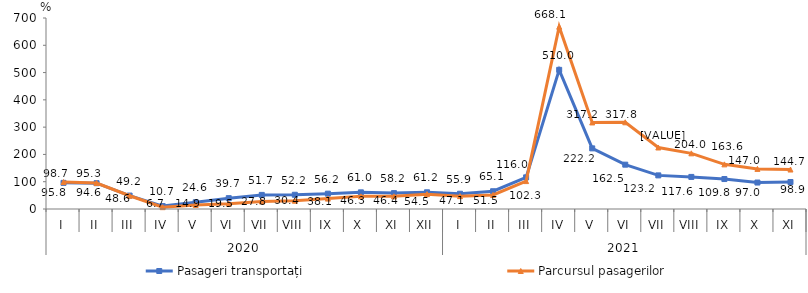
| Category | Pasageri transportați | Parcursul pasagerilor |
|---|---|---|
| 0 | 95.8 | 98.7 |
| 1 | 94.6 | 95.3 |
| 2 | 49.2 | 48.6 |
| 3 | 10.7 | 6.7 |
| 4 | 24.6 | 14.9 |
| 5 | 39.7 | 19.5 |
| 6 | 51.7 | 27.8 |
| 7 | 52.2 | 30.4 |
| 8 | 56.2 | 38.1 |
| 9 | 61 | 46.3 |
| 10 | 58.2 | 46.4 |
| 11 | 61.2 | 54.5 |
| 12 | 55.9 | 47.1 |
| 13 | 65.1 | 51.5 |
| 14 | 116 | 102.3 |
| 15 | 510 | 668.1 |
| 16 | 222.2 | 317.2 |
| 17 | 162.5 | 317.8 |
| 18 | 123.2 | 225.4 |
| 19 | 117.6 | 204 |
| 20 | 109.8 | 163.6 |
| 21 | 97 | 147 |
| 22 | 98.9 | 144.7 |